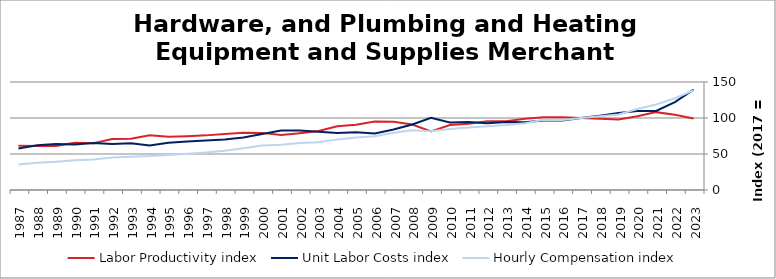
| Category | Labor Productivity index | Unit Labor Costs index | Hourly Compensation index |
|---|---|---|---|
| 2023.0 | 99.311 | 139.315 | 138.355 |
| 2022.0 | 104.449 | 121.999 | 127.427 |
| 2021.0 | 108.145 | 109.784 | 118.727 |
| 2020.0 | 102.53 | 109.743 | 112.52 |
| 2019.0 | 97.916 | 106.975 | 104.746 |
| 2018.0 | 99.053 | 103.298 | 102.319 |
| 2017.0 | 100 | 100 | 100 |
| 2016.0 | 100.918 | 96.392 | 97.276 |
| 2015.0 | 100.878 | 96.69 | 97.539 |
| 2014.0 | 98.82 | 93.953 | 92.844 |
| 2013.0 | 95.451 | 94.425 | 90.13 |
| 2012.0 | 95.351 | 92.829 | 88.513 |
| 2011.0 | 91.965 | 94.481 | 86.889 |
| 2010.0 | 90.141 | 93.864 | 84.61 |
| 2009.0 | 81.41 | 100.356 | 81.7 |
| 2008.0 | 90.947 | 91.067 | 82.823 |
| 2007.0 | 94.764 | 83.977 | 79.581 |
| 2006.0 | 95.131 | 78.614 | 74.786 |
| 2005.0 | 90.687 | 80.252 | 72.777 |
| 2004.0 | 88.663 | 79.288 | 70.3 |
| 2003.0 | 81.933 | 81.038 | 66.397 |
| 2002.0 | 78.85 | 82.632 | 65.155 |
| 2001.0 | 76.24 | 82.519 | 62.913 |
| 2000.0 | 79.336 | 77.728 | 61.666 |
| 1999.0 | 79.61 | 72.834 | 57.983 |
| 1998.0 | 77.839 | 70.233 | 54.668 |
| 1997.0 | 75.87 | 68.632 | 52.071 |
| 1996.0 | 74.773 | 67.506 | 50.476 |
| 1995.0 | 73.957 | 65.587 | 48.506 |
| 1994.0 | 76.133 | 61.86 | 47.095 |
| 1993.0 | 71.268 | 64.993 | 46.32 |
| 1992.0 | 70.717 | 63.884 | 45.177 |
| 1991.0 | 64.828 | 65.413 | 42.406 |
| 1990.0 | 65.663 | 63.056 | 41.405 |
| 1989.0 | 61.181 | 63.891 | 39.089 |
| 1988.0 | 61.079 | 62.151 | 37.961 |
| 1987.0 | 61.445 | 57.671 | 35.436 |